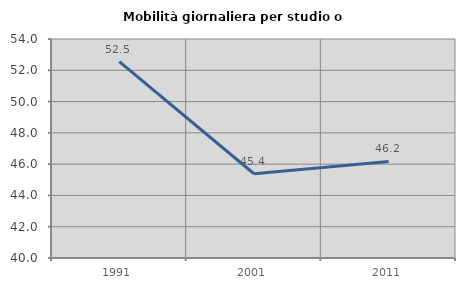
| Category | Mobilità giornaliera per studio o lavoro |
|---|---|
| 1991.0 | 52.549 |
| 2001.0 | 45.386 |
| 2011.0 | 46.175 |